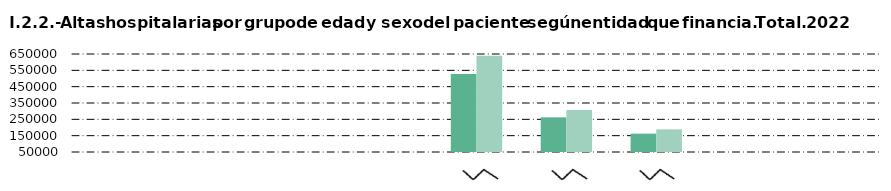
| Category | Hombre | Mujer |
|---|---|---|
| Andalucía | 881 | 672 |
| Castilla y León  | 2013 | 1900 |
| Castilla - La Mancha | 4721 | 5585 |
| Extremadura | 1146 | 817 |
| Madrid (Comunidad de) | 528199 | 639450 |
| Resto de CC.AA. | 262158 | 306406 |
| Mutualidades y aseguradoras | 162330 | 188533 |
| Particulares | 21248 | 34156 |
| Otros | 4047 | 8327 |